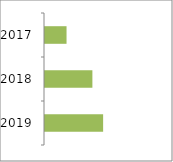
| Category | Series 0 |
|---|---|
| 2019.0 | 93614 |
| 2018.0 | 91868 |
| 2017.0 | 87665 |